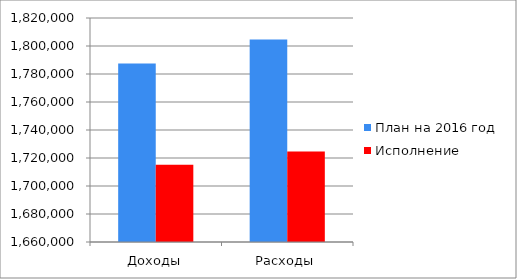
| Category | План на 2016 год | Исполнение |
|---|---|---|
| Доходы | 1787443.5 | 1715241 |
| Расходы | 1804669.4 | 1724667.9 |